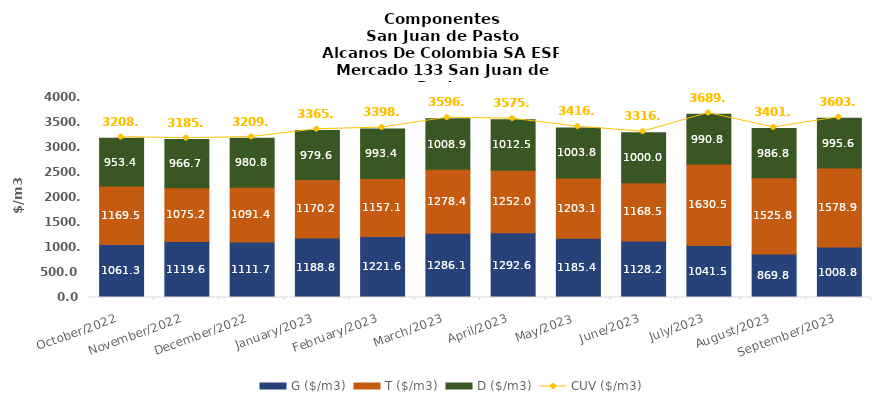
| Category | G ($/m3) | T ($/m3) | D ($/m3) |
|---|---|---|---|
| 2022-10-01 | 1061.27 | 1169.53 | 953.42 |
| 2022-11-01 | 1119.61 | 1075.19 | 966.69 |
| 2022-12-01 | 1111.69 | 1091.36 | 980.8 |
| 2023-01-01 | 1188.81 | 1170.15 | 979.57 |
| 2023-02-01 | 1221.59 | 1157.08 | 993.4 |
| 2023-03-01 | 1286.09 | 1278.38 | 1008.86 |
| 2023-04-01 | 1292.6 | 1251.95 | 1012.48 |
| 2023-05-01 | 1185.42 | 1203.07 | 1003.78 |
| 2023-06-01 | 1128.21 | 1168.47 | 999.96 |
| 2023-07-01 | 1041.54 | 1630.51 | 990.77 |
| 2023-08-01 | 869.82 | 1525.81 | 986.78 |
| 2023-09-01 | 1008.82 | 1578.87 | 995.55 |